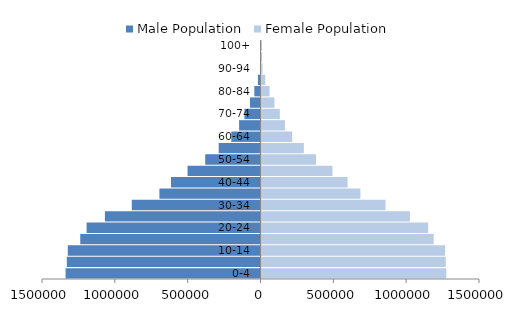
| Category | Male Population | Female Population |
|---|---|---|
| 0-4 | -1338215 | 1268876 |
| 5-9 | -1329539 | 1264863 |
| 10-14 | -1323015 | 1260120 |
| 15-19 | -1237464 | 1182120 |
| 20-24 | -1193678 | 1144032 |
| 25-29 | -1068245 | 1018641 |
| 30-34 | -883578 | 851369 |
| 35-39 | -694014 | 678919 |
| 40-44 | -614468 | 591159 |
| 45-49 | -500795 | 487094 |
| 50-54 | -379524 | 374248 |
| 55-59 | -287017 | 290448 |
| 60-64 | -200523 | 210769 |
| 65-69 | -146970 | 160856 |
| 70-74 | -110283 | 125683 |
| 75-79 | -72333 | 88792 |
| 80-84 | -42390 | 55387 |
| 85-89 | -17651 | 25353 |
| 90-94 | -3788 | 6642 |
| 95-99 | 524 | 1177 |
| 100+ | 45 | 139 |